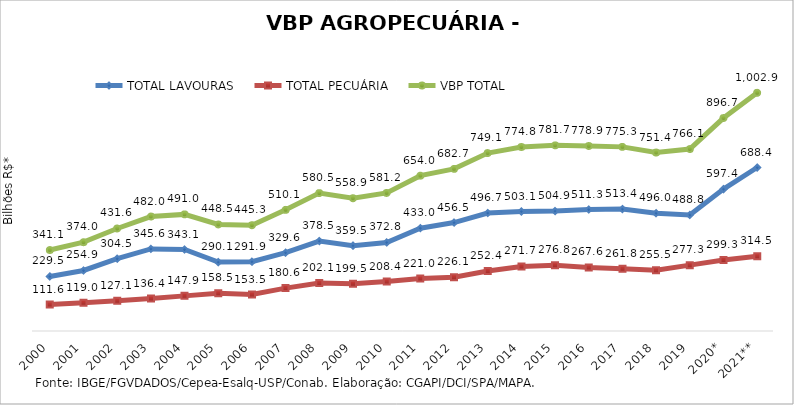
| Category | TOTAL LAVOURAS | TOTAL PECUÁRIA | VBP TOTAL |
|---|---|---|---|
| 2000 | 229.503 | 111.559 | 341.062 |
| 2001 | 254.936 | 119.019 | 373.955 |
| 2002 | 304.529 | 127.054 | 431.583 |
| 2003 | 345.638 | 136.37 | 482.009 |
| 2004 | 343.108 | 147.923 | 491.031 |
| 2005 | 290.082 | 158.461 | 448.544 |
| 2006 | 291.854 | 153.472 | 445.326 |
| 2007 | 329.596 | 180.551 | 510.147 |
| 2008 | 378.458 | 202.08 | 580.537 |
| 2009 | 359.485 | 199.451 | 558.936 |
| 2010 | 372.826 | 208.388 | 581.213 |
| 2011 | 432.991 | 221.046 | 654.037 |
| 2012 | 456.536 | 226.117 | 682.653 |
| 2013 | 496.715 | 252.432 | 749.147 |
| 2014 | 503.105 | 271.689 | 774.794 |
| 2015 | 504.931 | 276.777 | 781.708 |
| 2016 | 511.316 | 267.574 | 778.89 |
| 2017 | 513.439 | 261.825 | 775.263 |
| 2018 | 495.953 | 255.492 | 751.445 |
| 2019 | 488.821 | 277.283 | 766.104 |
| 2020* | 597.373 | 299.286 | 896.659 |
| 2021** | 688.369 | 314.484 | 1002.853 |